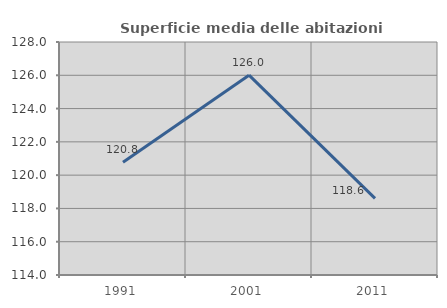
| Category | Superficie media delle abitazioni occupate |
|---|---|
| 1991.0 | 120.771 |
| 2001.0 | 126.008 |
| 2011.0 | 118.604 |